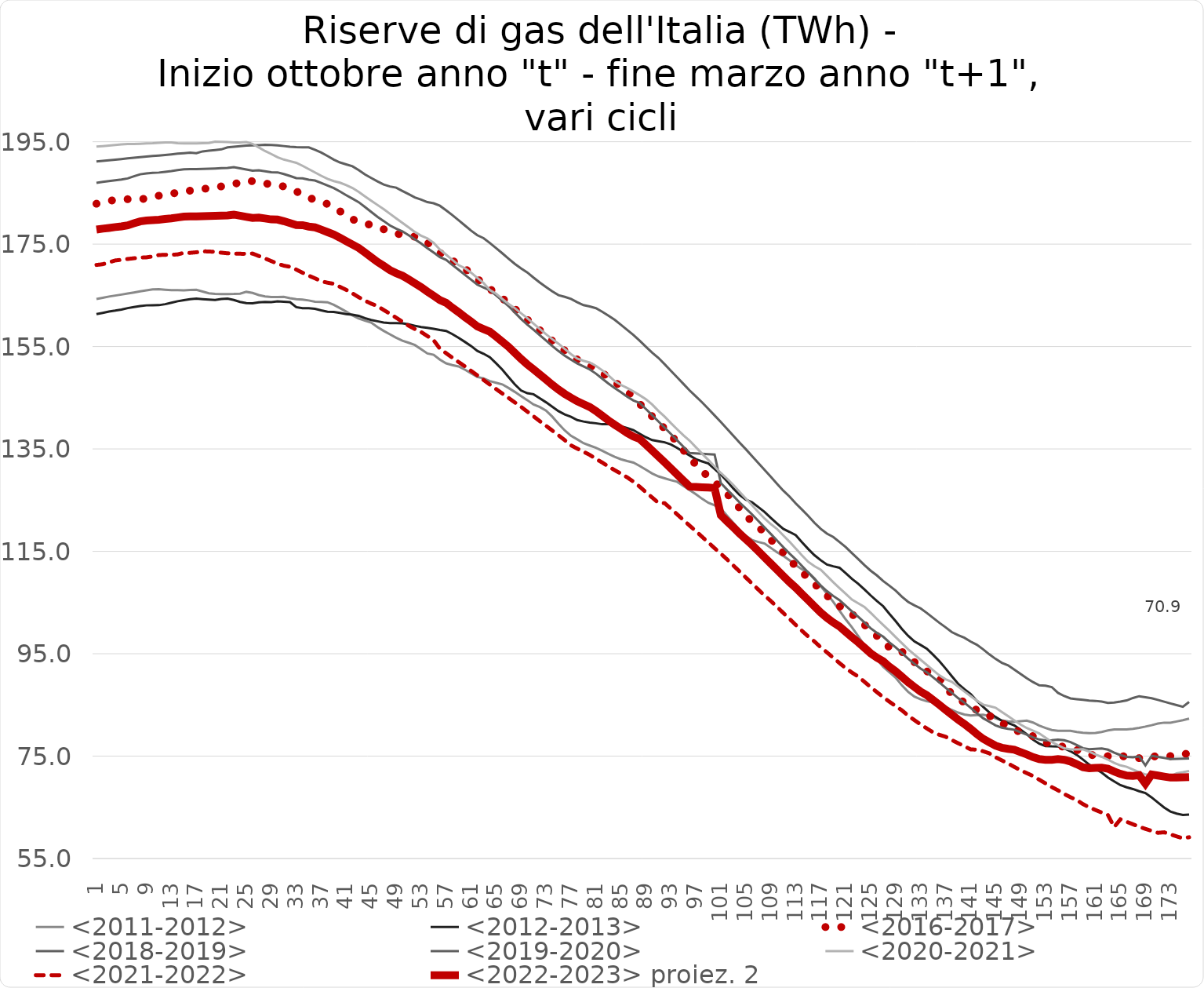
| Category | <2011-2012> | <2012-2013> | <2016-2017> | <2018-2019> | <2019-2020> | <2020-2021> | <2021-2022> | <2022-2023> proiez. 2 |
|---|---|---|---|---|---|---|---|---|
| 1.0 | 164.28 | 161.325 | 182.89 | 186.966 | 191.146 | 194.044 | 170.933 | 177.846 |
| 2.0 | 164.523 | 161.574 | 183.183 | 187.153 | 191.28 | 194.151 | 171.078 | 178.024 |
| 3.0 | 164.768 | 161.839 | 183.434 | 187.307 | 191.392 | 194.264 | 171.438 | 178.17 |
| 4.0 | 164.958 | 162.014 | 183.638 | 187.474 | 191.501 | 194.377 | 171.813 | 178.329 |
| 5.0 | 165.149 | 162.228 | 183.717 | 187.626 | 191.621 | 194.494 | 171.944 | 178.474 |
| 6.0 | 165.348 | 162.505 | 183.777 | 187.833 | 191.754 | 194.574 | 172.102 | 178.671 |
| 7.0 | 165.545 | 162.725 | 183.762 | 188.248 | 191.89 | 194.576 | 172.243 | 179.065 |
| 8.0 | 165.768 | 162.892 | 183.729 | 188.643 | 192 | 194.606 | 172.367 | 179.441 |
| 9.0 | 165.968 | 163.041 | 183.946 | 188.816 | 192.115 | 194.661 | 172.42 | 179.605 |
| 10.0 | 166.179 | 163.072 | 184.252 | 188.909 | 192.208 | 194.707 | 172.601 | 179.694 |
| 11.0 | 166.21 | 163.081 | 184.461 | 188.983 | 192.298 | 194.791 | 172.871 | 179.764 |
| 12.0 | 166.105 | 163.273 | 184.693 | 189.134 | 192.412 | 194.88 | 172.916 | 179.908 |
| 13.0 | 166.006 | 163.557 | 184.886 | 189.262 | 192.533 | 194.863 | 172.911 | 180.03 |
| 14.0 | 166.005 | 163.846 | 185.021 | 189.452 | 192.666 | 194.698 | 172.997 | 180.211 |
| 15.0 | 165.96 | 164.072 | 185.181 | 189.617 | 192.762 | 194.674 | 173.305 | 180.367 |
| 16.0 | 166.032 | 164.247 | 185.448 | 189.659 | 192.877 | 194.675 | 173.301 | 180.408 |
| 17.0 | 166.08 | 164.347 | 185.707 | 189.659 | 192.749 | 194.69 | 173.409 | 180.408 |
| 18.0 | 165.748 | 164.248 | 185.811 | 189.694 | 193.116 | 194.725 | 173.6 | 180.44 |
| 19.0 | 165.401 | 164.161 | 185.869 | 189.741 | 193.241 | 194.762 | 173.563 | 180.486 |
| 20.0 | 165.276 | 164.094 | 186.018 | 189.785 | 193.375 | 195.014 | 173.49 | 180.527 |
| 21.0 | 165.24 | 164.282 | 186.276 | 189.839 | 193.51 | 194.983 | 173.335 | 180.579 |
| 22.0 | 165.259 | 164.372 | 186.39 | 189.89 | 193.906 | 194.946 | 173.207 | 180.627 |
| 23.0 | 165.278 | 164.101 | 186.736 | 190.044 | 194.019 | 194.876 | 173.155 | 180.774 |
| 24.0 | 165.334 | 163.72 | 187.044 | 189.81 | 194.139 | 194.875 | 173.121 | 180.551 |
| 25.0 | 165.681 | 163.473 | 187.403 | 189.578 | 194.251 | 194.927 | 173.108 | 180.331 |
| 26.0 | 165.472 | 163.458 | 187.287 | 189.344 | 194.304 | 194.594 | 173.16 | 180.108 |
| 27.0 | 165.06 | 163.628 | 187.195 | 189.431 | 194.346 | 193.894 | 172.685 | 180.191 |
| 28.0 | 164.8 | 163.709 | 186.89 | 189.239 | 194.395 | 193.186 | 172.202 | 180.008 |
| 29.0 | 164.68 | 163.679 | 186.606 | 189.053 | 194.382 | 192.605 | 171.691 | 179.831 |
| 30.0 | 164.662 | 163.84 | 186.442 | 189.021 | 194.306 | 191.974 | 171.193 | 179.801 |
| 31.0 | 164.696 | 163.753 | 186.273 | 188.699 | 194.157 | 191.521 | 170.798 | 179.494 |
| 32.0 | 164.442 | 163.674 | 185.771 | 188.309 | 194.023 | 191.207 | 170.576 | 179.124 |
| 33.0 | 164.24 | 162.689 | 185.302 | 187.895 | 193.942 | 190.887 | 170.035 | 178.73 |
| 34.0 | 164.159 | 162.475 | 184.726 | 187.86 | 193.903 | 190.303 | 169.423 | 178.696 |
| 35.0 | 164.002 | 162.482 | 184.146 | 187.577 | 193.897 | 189.646 | 168.84 | 178.427 |
| 36.0 | 163.765 | 162.363 | 183.583 | 187.423 | 193.438 | 189.003 | 168.324 | 178.281 |
| 37.0 | 163.701 | 162.056 | 183.211 | 186.962 | 192.899 | 188.35 | 167.755 | 177.843 |
| 38.0 | 163.642 | 161.787 | 182.843 | 186.45 | 192.214 | 187.744 | 167.47 | 177.355 |
| 39.0 | 163.148 | 161.744 | 182.125 | 185.941 | 191.507 | 187.32 | 167.248 | 176.871 |
| 40.0 | 162.507 | 161.55 | 181.415 | 185.28 | 190.949 | 187.009 | 166.657 | 176.243 |
| 41.0 | 161.822 | 161.341 | 180.646 | 184.568 | 190.579 | 186.522 | 166.07 | 175.565 |
| 42.0 | 161.073 | 161.212 | 179.88 | 183.888 | 190.211 | 185.963 | 165.386 | 174.918 |
| 43.0 | 160.49 | 161.002 | 179.277 | 183.19 | 189.465 | 185.195 | 164.635 | 174.255 |
| 44.0 | 160.07 | 160.555 | 178.976 | 182.258 | 188.629 | 184.34 | 163.963 | 173.368 |
| 45.0 | 159.669 | 160.195 | 178.774 | 181.303 | 187.926 | 183.485 | 163.377 | 172.459 |
| 46.0 | 158.816 | 159.941 | 178.288 | 180.341 | 187.252 | 182.661 | 162.91 | 171.544 |
| 47.0 | 158.058 | 159.703 | 177.902 | 179.514 | 186.639 | 181.825 | 162.14 | 170.758 |
| 48.0 | 157.385 | 159.564 | 177.493 | 178.645 | 186.262 | 180.936 | 161.408 | 169.931 |
| 49.0 | 156.729 | 159.558 | 177.1 | 178.012 | 186.032 | 180.042 | 160.629 | 169.328 |
| 50.0 | 156.154 | 159.525 | 176.803 | 177.492 | 185.393 | 179.156 | 159.848 | 168.834 |
| 51.0 | 155.738 | 159.333 | 176.634 | 176.728 | 184.775 | 178.262 | 159.065 | 168.108 |
| 52.0 | 155.297 | 159.06 | 176.458 | 175.923 | 184.128 | 177.368 | 158.416 | 167.341 |
| 53.0 | 154.462 | 158.796 | 176.08 | 175.14 | 183.698 | 176.654 | 157.835 | 166.597 |
| 54.0 | 153.648 | 158.656 | 175.319 | 174.218 | 183.211 | 176.136 | 157.044 | 165.72 |
| 55.0 | 153.394 | 158.472 | 174.332 | 173.363 | 182.986 | 175.252 | 156.245 | 164.906 |
| 56.0 | 152.44 | 158.224 | 173.32 | 172.474 | 182.497 | 173.957 | 154.587 | 164.061 |
| 57.0 | 151.708 | 158.039 | 172.376 | 171.93 | 181.602 | 172.946 | 153.699 | 163.543 |
| 58.0 | 151.371 | 157.429 | 171.735 | 170.924 | 180.675 | 171.925 | 152.817 | 162.587 |
| 59.0 | 151.118 | 156.706 | 171.193 | 169.997 | 179.667 | 170.903 | 151.973 | 161.705 |
| 60.0 | 150.496 | 155.915 | 170.25 | 169.017 | 178.66 | 170.308 | 151.138 | 160.772 |
| 61.0 | 149.787 | 155.105 | 169.221 | 168.064 | 177.642 | 169.436 | 150.25 | 159.866 |
| 62.0 | 149.055 | 154.155 | 168.177 | 167.082 | 176.739 | 168.419 | 149.364 | 158.932 |
| 63.0 | 148.783 | 153.588 | 167.304 | 166.532 | 176.172 | 167.404 | 148.472 | 158.409 |
| 64.0 | 148.249 | 152.91 | 166.292 | 165.994 | 175.228 | 166.036 | 147.575 | 157.897 |
| 65.0 | 147.932 | 151.729 | 165.29 | 165.006 | 174.224 | 165.324 | 146.7 | 156.957 |
| 66.0 | 147.606 | 150.491 | 164.434 | 163.952 | 173.213 | 164.317 | 145.825 | 155.955 |
| 67.0 | 146.904 | 149.047 | 163.392 | 162.9 | 172.168 | 163.33 | 144.964 | 154.954 |
| 68.0 | 146.144 | 147.613 | 162.358 | 161.656 | 171.148 | 162.506 | 144.086 | 153.77 |
| 69.0 | 145.326 | 146.426 | 161.311 | 160.407 | 170.258 | 161.497 | 143.221 | 152.582 |
| 70.0 | 144.531 | 145.887 | 160.264 | 159.286 | 169.468 | 160.545 | 142.289 | 151.516 |
| 71.0 | 143.686 | 145.68 | 159.179 | 158.28 | 168.461 | 159.487 | 141.365 | 150.559 |
| 72.0 | 143.184 | 144.9 | 158.19 | 157.221 | 167.504 | 158.441 | 140.428 | 149.552 |
| 73.0 | 142.495 | 144.112 | 157.227 | 156.174 | 166.634 | 157.403 | 139.519 | 148.556 |
| 74.0 | 141.311 | 143.253 | 156.112 | 155.108 | 165.794 | 156.446 | 138.598 | 147.542 |
| 75.0 | 139.927 | 142.39 | 155.035 | 154.122 | 165.038 | 155.558 | 137.659 | 146.604 |
| 76.0 | 138.616 | 141.749 | 154.21 | 153.221 | 164.7 | 154.524 | 136.716 | 145.747 |
| 77.0 | 137.564 | 141.277 | 153.305 | 152.44 | 164.302 | 153.52 | 135.7 | 145.004 |
| 78.0 | 136.869 | 140.637 | 152.461 | 151.705 | 163.651 | 152.633 | 135.062 | 144.305 |
| 79.0 | 136.122 | 140.352 | 151.76 | 151.12 | 163.099 | 152.212 | 134.454 | 143.748 |
| 80.0 | 135.659 | 140.131 | 151.224 | 150.539 | 162.824 | 151.868 | 133.837 | 143.196 |
| 81.0 | 135.215 | 140.011 | 150.686 | 149.706 | 162.484 | 151.233 | 133.06 | 142.403 |
| 82.0 | 134.636 | 139.82 | 149.846 | 148.728 | 161.795 | 150.365 | 132.347 | 141.473 |
| 83.0 | 134.026 | 139.827 | 148.965 | 147.769 | 161.038 | 149.346 | 131.557 | 140.561 |
| 84.0 | 133.464 | 139.696 | 148.096 | 146.891 | 160.215 | 148.244 | 130.854 | 139.726 |
| 85.0 | 132.98 | 139.419 | 147.134 | 146.071 | 159.236 | 147.5 | 130.162 | 138.946 |
| 86.0 | 132.64 | 139.079 | 146.28 | 145.196 | 158.247 | 146.909 | 129.45 | 138.114 |
| 87.0 | 132.33 | 138.688 | 145.083 | 144.462 | 157.264 | 146.22 | 128.603 | 137.415 |
| 88.0 | 131.681 | 137.967 | 143.819 | 143.982 | 156.144 | 145.488 | 127.629 | 136.959 |
| 89.0 | 130.959 | 137.276 | 142.535 | 142.797 | 154.962 | 144.704 | 126.552 | 135.831 |
| 90.0 | 130.205 | 136.724 | 141.357 | 141.587 | 153.801 | 143.691 | 125.514 | 134.68 |
| 91.0 | 129.646 | 136.519 | 140.121 | 140.373 | 152.783 | 142.426 | 124.47 | 133.526 |
| 92.0 | 129.268 | 136.297 | 138.984 | 139.158 | 151.54 | 141.31 | 124.41 | 132.37 |
| 93.0 | 128.901 | 135.872 | 137.714 | 137.932 | 150.269 | 140.043 | 123.327 | 131.204 |
| 94.0 | 128.59 | 135.206 | 136.264 | 136.684 | 148.989 | 138.85 | 122.224 | 130.017 |
| 95.0 | 127.781 | 134.426 | 134.78 | 135.436 | 147.711 | 137.667 | 121.129 | 128.83 |
| 96.0 | 126.947 | 133.724 | 133.304 | 134.213 | 146.43 | 136.613 | 120.019 | 127.666 |
| 97.0 | 126.146 | 132.997 | 131.943 | 134.116 | 145.25 | 135.341 | 118.944 | 127.574 |
| 98.0 | 125.26 | 132.563 | 130.715 | 134.042 | 144.095 | 134.071 | 117.832 | 127.503 |
| 99.0 | 124.481 | 132.156 | 129.536 | 133.992 | 142.825 | 132.838 | 116.724 | 127.456 |
| 100.0 | 123.978 | 131.066 | 128.514 | 133.898 | 141.542 | 131.573 | 115.612 | 127.367 |
| 101.0 | 123.371 | 129.99 | 127.447 | 128.326 | 140.272 | 130.308 | 114.538 | 122.066 |
| 102.0 | 121.942 | 128.678 | 126.269 | 127.056 | 138.918 | 129.185 | 113.414 | 120.858 |
| 103.0 | 120.548 | 127.289 | 124.79 | 125.826 | 137.56 | 127.96 | 112.235 | 119.689 |
| 104.0 | 119.158 | 126.034 | 123.45 | 124.551 | 136.229 | 126.62 | 111.066 | 118.475 |
| 105.0 | 118.024 | 125.088 | 122.039 | 123.387 | 134.953 | 125.311 | 109.89 | 117.368 |
| 106.0 | 117.22 | 124.596 | 120.786 | 122.209 | 133.597 | 123.998 | 108.709 | 116.248 |
| 107.0 | 116.828 | 123.647 | 119.751 | 120.946 | 132.242 | 122.658 | 107.535 | 115.046 |
| 108.0 | 116.537 | 122.696 | 118.698 | 119.665 | 130.905 | 121.416 | 106.374 | 113.828 |
| 109.0 | 115.679 | 121.535 | 117.288 | 118.395 | 129.553 | 120.334 | 105.306 | 112.62 |
| 110.0 | 114.825 | 120.446 | 116.044 | 117.106 | 128.189 | 119.375 | 104.146 | 111.393 |
| 111.0 | 114.112 | 119.39 | 114.753 | 115.823 | 126.855 | 118.113 | 102.969 | 110.173 |
| 112.0 | 113.241 | 118.797 | 113.401 | 114.577 | 125.695 | 116.871 | 101.806 | 108.988 |
| 113.0 | 112.302 | 118.155 | 112.06 | 113.423 | 124.346 | 115.531 | 100.629 | 107.89 |
| 114.0 | 111.5 | 116.77 | 110.897 | 112.137 | 123.15 | 114.198 | 99.469 | 106.667 |
| 115.0 | 110.894 | 115.448 | 109.837 | 110.875 | 121.904 | 112.944 | 98.365 | 105.466 |
| 116.0 | 109.73 | 114.241 | 108.664 | 109.587 | 120.565 | 112.082 | 97.384 | 104.241 |
| 117.0 | 108.188 | 113.268 | 107.456 | 108.318 | 119.396 | 111.411 | 96.259 | 103.034 |
| 118.0 | 106.711 | 112.411 | 106.353 | 107.228 | 118.46 | 110.19 | 95.256 | 101.998 |
| 119.0 | 105.132 | 112.08 | 105.28 | 106.291 | 117.798 | 108.964 | 94.214 | 101.106 |
| 120.0 | 103.42 | 111.801 | 104.305 | 105.469 | 116.821 | 107.831 | 93.178 | 100.324 |
| 121.0 | 101.706 | 110.732 | 103.5 | 104.371 | 115.839 | 106.702 | 92.19 | 99.28 |
| 122.0 | 100.163 | 109.634 | 102.744 | 103.272 | 114.636 | 105.569 | 91.314 | 98.234 |
| 123.0 | 98.419 | 108.676 | 101.681 | 102.215 | 113.498 | 104.854 | 90.544 | 97.229 |
| 124.0 | 96.634 | 107.558 | 100.651 | 101.106 | 112.299 | 104.141 | 89.513 | 96.174 |
| 125.0 | 95.161 | 106.385 | 99.582 | 99.964 | 111.218 | 102.984 | 88.476 | 95.088 |
| 126.0 | 93.878 | 105.309 | 98.473 | 99.057 | 110.292 | 101.784 | 87.49 | 94.225 |
| 127.0 | 92.453 | 104.288 | 97.332 | 98.329 | 109.201 | 100.609 | 86.522 | 93.532 |
| 128.0 | 91.396 | 102.788 | 96.237 | 97.198 | 108.275 | 99.46 | 85.626 | 92.456 |
| 129.0 | 90.328 | 101.374 | 95.416 | 96.255 | 107.33 | 98.249 | 84.77 | 91.56 |
| 130.0 | 88.823 | 99.838 | 95.401 | 95.142 | 106.149 | 97.051 | 83.946 | 90.501 |
| 131.0 | 87.559 | 98.495 | 94.34 | 94.03 | 105.12 | 95.868 | 82.911 | 89.443 |
| 132.0 | 86.621 | 97.4 | 93.37 | 93.044 | 104.443 | 94.844 | 82.035 | 88.505 |
| 133.0 | 86.094 | 96.704 | 92.499 | 92.091 | 103.864 | 93.818 | 81.181 | 87.599 |
| 134.0 | 85.708 | 95.982 | 91.582 | 91.352 | 102.964 | 92.793 | 80.402 | 86.896 |
| 135.0 | 85.493 | 94.792 | 90.928 | 90.386 | 101.992 | 91.767 | 79.639 | 85.977 |
| 136.0 | 85.492 | 93.544 | 90.273 | 89.382 | 101.04 | 90.783 | 79.162 | 85.022 |
| 137.0 | 84.663 | 92.111 | 88.236 | 88.35 | 100.156 | 90.009 | 78.788 | 84.04 |
| 138.0 | 84.01 | 90.598 | 87.235 | 87.351 | 99.22 | 89.504 | 78.14 | 83.09 |
| 139.0 | 83.504 | 89.135 | 86.347 | 86.335 | 98.613 | 88.587 | 77.528 | 82.123 |
| 140.0 | 83.13 | 88.077 | 85.439 | 85.453 | 98.115 | 87.634 | 76.935 | 81.285 |
| 141.0 | 82.929 | 87.119 | 84.504 | 84.451 | 97.381 | 86.72 | 76.321 | 80.331 |
| 142.0 | 82.999 | 85.819 | 84.01 | 83.378 | 96.752 | 85.835 | 76.254 | 79.311 |
| 143.0 | 83.099 | 84.631 | 83.658 | 82.412 | 95.871 | 85.064 | 75.96 | 78.393 |
| 144.0 | 82.843 | 83.519 | 82.895 | 81.7 | 94.883 | 84.77 | 75.546 | 77.714 |
| 145.0 | 82.396 | 82.649 | 82.074 | 80.993 | 93.991 | 84.449 | 74.779 | 77.042 |
| 146.0 | 81.971 | 81.905 | 81.471 | 80.567 | 93.221 | 83.626 | 74.172 | 76.637 |
| 147.0 | 81.79 | 81.46 | 80.798 | 80.335 | 92.734 | 82.807 | 73.564 | 76.416 |
| 148.0 | 81.696 | 80.99 | 80.109 | 80.162 | 91.907 | 81.993 | 72.896 | 76.252 |
| 149.0 | 81.813 | 80.18 | 79.725 | 79.665 | 91.055 | 81.173 | 72.236 | 75.779 |
| 150.0 | 81.924 | 79.264 | 79.42 | 79.19 | 90.202 | 80.49 | 71.677 | 75.328 |
| 151.0 | 81.556 | 78.197 | 78.875 | 78.648 | 89.46 | 79.959 | 71.113 | 74.811 |
| 152.0 | 80.955 | 77.449 | 78.25 | 78.246 | 88.822 | 79.446 | 70.396 | 74.429 |
| 153.0 | 80.508 | 76.972 | 77.684 | 78.078 | 88.764 | 78.597 | 69.676 | 74.27 |
| 154.0 | 80.109 | 76.916 | 77.235 | 78.092 | 88.487 | 77.754 | 68.959 | 74.283 |
| 155.0 | 79.942 | 76.89 | 76.931 | 78.223 | 87.348 | 77.125 | 68.318 | 74.407 |
| 156.0 | 79.942 | 76.503 | 76.843 | 78.1 | 86.73 | 76.536 | 67.6 | 74.29 |
| 157.0 | 79.942 | 75.956 | 76.758 | 77.746 | 86.269 | 76.318 | 66.974 | 73.953 |
| 158.0 | 79.711 | 75.247 | 76.226 | 77.179 | 86.117 | 76.322 | 66.428 | 73.414 |
| 159.0 | 79.573 | 74.341 | 75.738 | 76.555 | 85.987 | 76.331 | 65.624 | 72.821 |
| 160.0 | 79.491 | 73.348 | 75.342 | 76.348 | 85.853 | 75.852 | 65.002 | 72.624 |
| 161.0 | 79.534 | 72.522 | 75.069 | 76.428 | 85.789 | 75.326 | 64.481 | 72.699 |
| 162.0 | 79.704 | 71.79 | 74.843 | 76.482 | 85.656 | 74.853 | 63.977 | 72.751 |
| 163.0 | 80.014 | 70.82 | 74.991 | 76.261 | 85.403 | 74.314 | 63.49 | 72.541 |
| 164.0 | 80.225 | 70.071 | 75.182 | 75.678 | 85.46 | 73.68 | 61.152 | 71.987 |
| 165.0 | 80.225 | 69.337 | 75.043 | 75.2 | 85.652 | 73.195 | 62.66 | 71.531 |
| 166.0 | 80.198 | 68.909 | 74.87 | 74.848 | 85.878 | 72.916 | 62.172 | 71.197 |
| 167.0 | 80.332 | 68.573 | 74.707 | 74.783 | 86.356 | 72.395 | 61.689 | 71.135 |
| 168.0 | 80.534 | 68.148 | 74.602 | 74.935 | 86.702 | 71.872 | 61.212 | 71.28 |
| 169.0 | 80.765 | 67.783 | 74.576 | 73.199 | 86.5 | 71.431 | 60.787 | 69.628 |
| 170.0 | 81.037 | 66.933 | 74.808 | 75.064 | 86.3 | 71.201 | 60.402 | 71.403 |
| 171.0 | 81.371 | 65.937 | 75.092 | 74.856 | 85.985 | 71.135 | 60.022 | 71.205 |
| 172.0 | 81.535 | 64.963 | 75.086 | 74.638 | 85.629 | 71.096 | 60.119 | 70.997 |
| 173.0 | 81.505 | 64.177 | 75.005 | 74.442 | 85.298 | 71.057 | 59.724 | 70.811 |
| 174.0 | 81.77 | 63.776 | 75.069 | 74.464 | 84.972 | 71.632 | 59.321 | 70.831 |
| 175.0 | 82.019 | 63.516 | 75.253 | 74.51 | 84.646 | 71.85 | 58.945 | 70.875 |
| 176.0 | 82.326 | 63.591 | 75.645 | 74.557 | 85.57 | 72.098 | 59.16 | 70.92 |